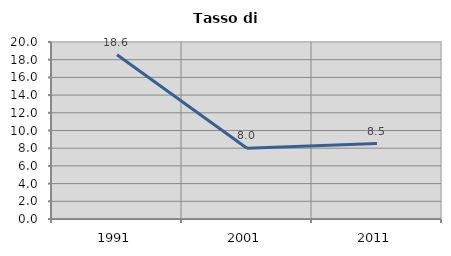
| Category | Tasso di disoccupazione   |
|---|---|
| 1991.0 | 18.565 |
| 2001.0 | 8 |
| 2011.0 | 8.527 |